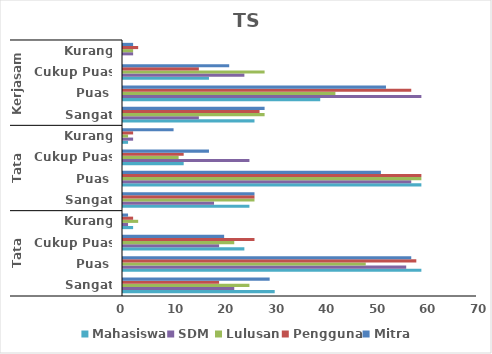
| Category | Mahasiswa | SDM | Lulusan | Pengguna | Mitra |
|---|---|---|---|---|---|
| 0 | 30 | 22 | 25 | 19 | 29 |
| 1 | 59 | 56 | 48 | 58 | 57 |
| 2 | 24 | 19 | 22 | 26 | 20 |
| 3 | 2 | 1 | 3 | 2 | 1 |
| 4 | 25 | 18 | 26 | 26 | 26 |
| 5 | 59 | 57 | 59 | 59 | 51 |
| 6 | 12 | 25 | 11 | 12 | 17 |
| 7 | 1 | 2 | 1 | 2 | 10 |
| 8 | 26 | 15 | 28 | 27 | 28 |
| 9 | 39 | 59 | 42 | 57 | 52 |
| 10 | 17 | 24 | 28 | 15 | 21 |
| 11 | 0 | 2 | 2 | 3 | 2 |